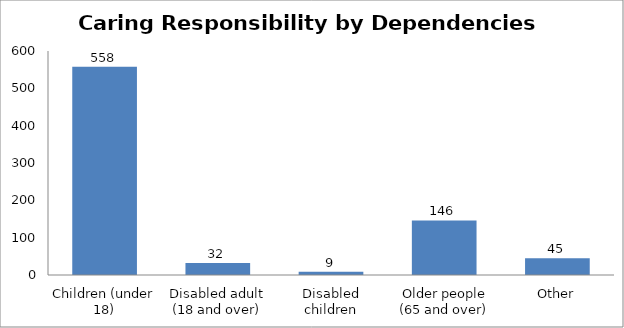
| Category | Total HC |
|---|---|
| Children (under 18) | 558 |
| Disabled adult (18 and over) | 32 |
| Disabled children | 9 |
| Older people (65 and over) | 146 |
| Other | 45 |